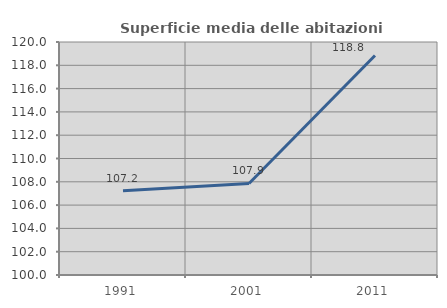
| Category | Superficie media delle abitazioni occupate |
|---|---|
| 1991.0 | 107.233 |
| 2001.0 | 107.859 |
| 2011.0 | 118.837 |